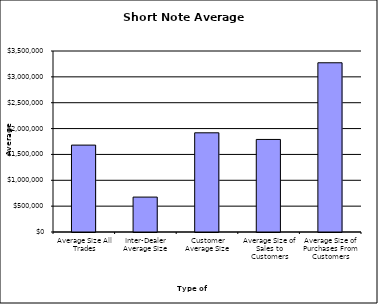
| Category | Security Type |
|---|---|
| Average Size All Trades | 1680297.908 |
| Inter-Dealer Average Size | 675227.907 |
| Customer Average Size | 1918086.133 |
| Average Size of Sales to Customers | 1789589.788 |
| Average Size of Purchases From Customers | 3272396.825 |